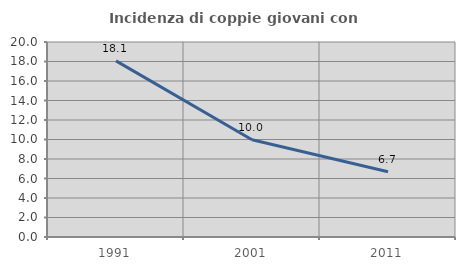
| Category | Incidenza di coppie giovani con figli |
|---|---|
| 1991.0 | 18.068 |
| 2001.0 | 9.978 |
| 2011.0 | 6.697 |